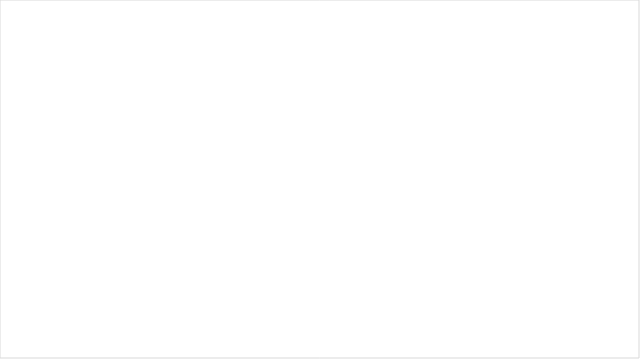
| Category | 0,00% |
|---|---|
| 0,00% | 0 |
|  | 0 |
|  | 0 |
|  | 0 |
|  | 0 |
|  | 0 |
| Otras | 0 |
| Sin marca | 0 |